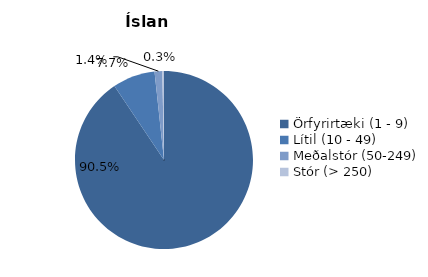
| Category | Ísland | EU27 |
|---|---|---|
| Örfyrirtæki (1 - 9) | 0.905 | 0.921 |
| Lítil (10 - 49) | 0.077 | 0.066 |
| Meðalstór (50-249) | 0.014 | 0.011 |
| Stór (> 250) | 0.003 | 0.002 |